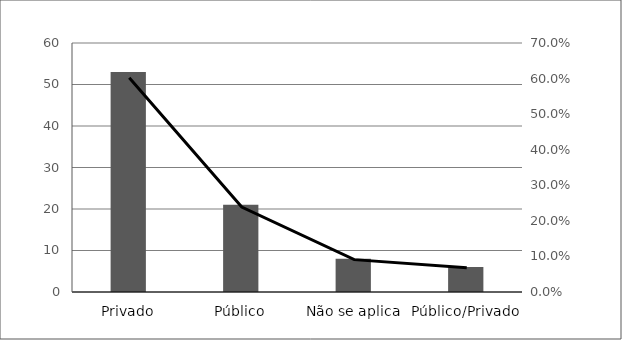
| Category | Series 0 |
|---|---|
| Privado | 53 |
| Público | 21 |
| Não se aplica | 8 |
| Público/Privado | 6 |